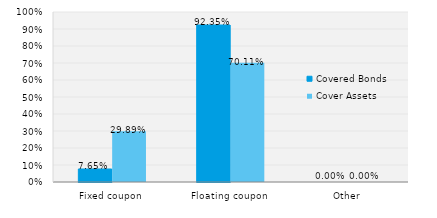
| Category | Covered Bonds | Cover Assets |
|---|---|---|
| Fixed coupon | 0.077 | 0.299 |
| Floating coupon | 0.923 | 0.701 |
| Other | 0 | 0 |